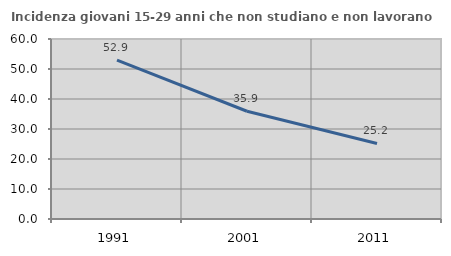
| Category | Incidenza giovani 15-29 anni che non studiano e non lavorano  |
|---|---|
| 1991.0 | 52.927 |
| 2001.0 | 35.917 |
| 2011.0 | 25.168 |